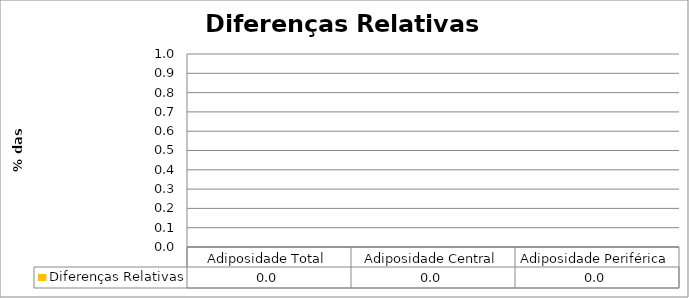
| Category | Diferenças Relativas |
|---|---|
| Adiposidade Total | 0 |
| Adiposidade Central | 0 |
| Adiposidade Periférica | 0 |